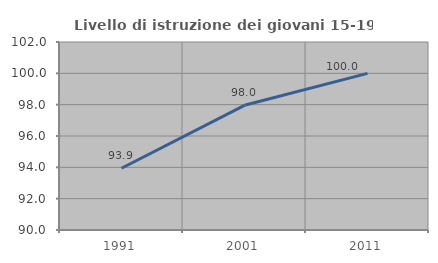
| Category | Livello di istruzione dei giovani 15-19 anni |
|---|---|
| 1991.0 | 93.939 |
| 2001.0 | 97.959 |
| 2011.0 | 100 |